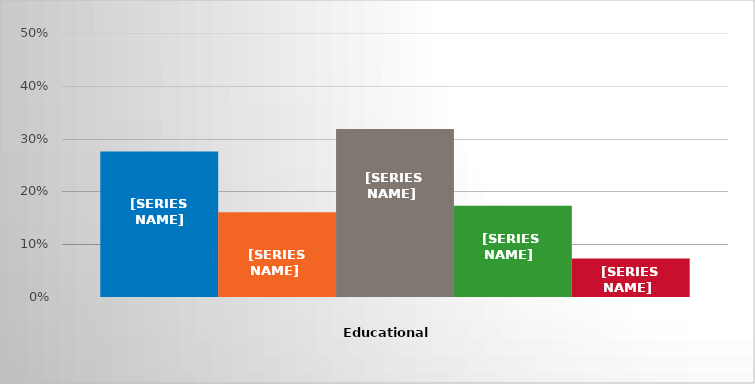
| Category | GED/High school diploma | Less than 1 year of college | 1 year of college | 2 years of college | Other |
|---|---|---|---|---|---|
| 0 | 0.276 | 0.161 | 0.318 | 0.173 | 0.073 |